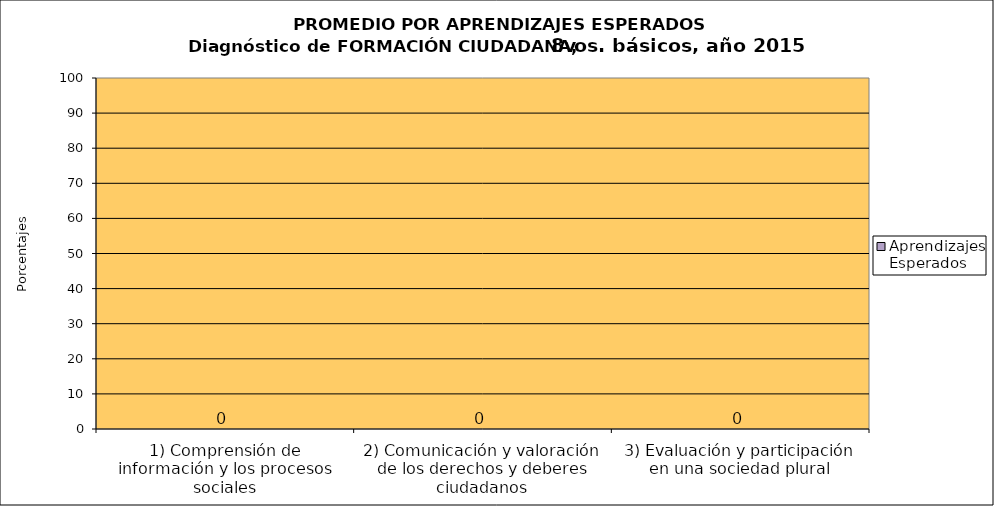
| Category | Aprendizajes Esperados |
|---|---|
| 1) Comprensión de información y los procesos sociales | 0 |
| 2) Comunicación y valoración de los derechos y deberes ciudadanos | 0 |
| 3) Evaluación y participación en una sociedad plural | 0 |